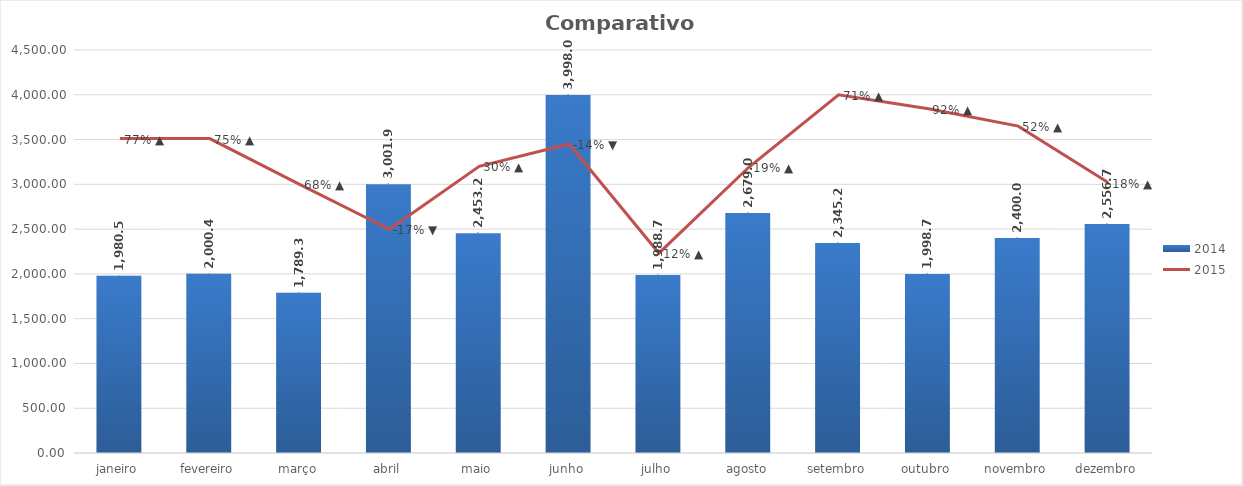
| Category | 2014 |
|---|---|
| janeiro | 1980.5 |
| fevereiro | 2000.45 |
| março | 1789.32 |
| abril | 3001.98 |
| maio | 2453.2 |
| junho | 3998 |
| julho | 1988.76 |
| agosto | 2679 |
| setembro | 2345.2 |
| outubro | 1998.76 |
| novembro | 2400 |
| dezembro | 2556.7 |